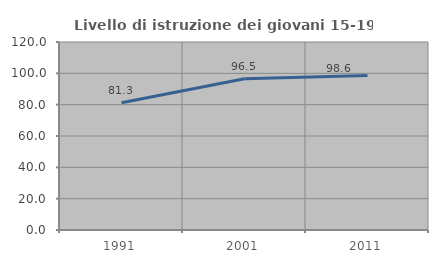
| Category | Livello di istruzione dei giovani 15-19 anni |
|---|---|
| 1991.0 | 81.25 |
| 2001.0 | 96.491 |
| 2011.0 | 98.551 |